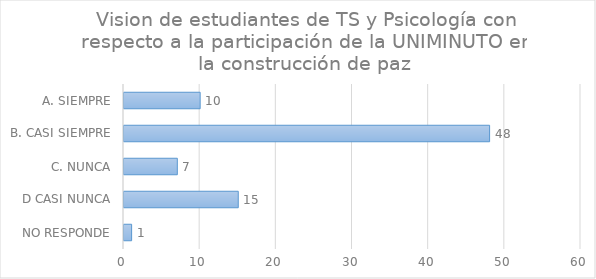
| Category | Series 0 |
|---|---|
| NO RESPONDE | 1 |
| D CASI NUNCA | 15 |
| C. NUNCA | 7 |
| B. CASI SIEMPRE | 48 |
| A. SIEMPRE | 10 |